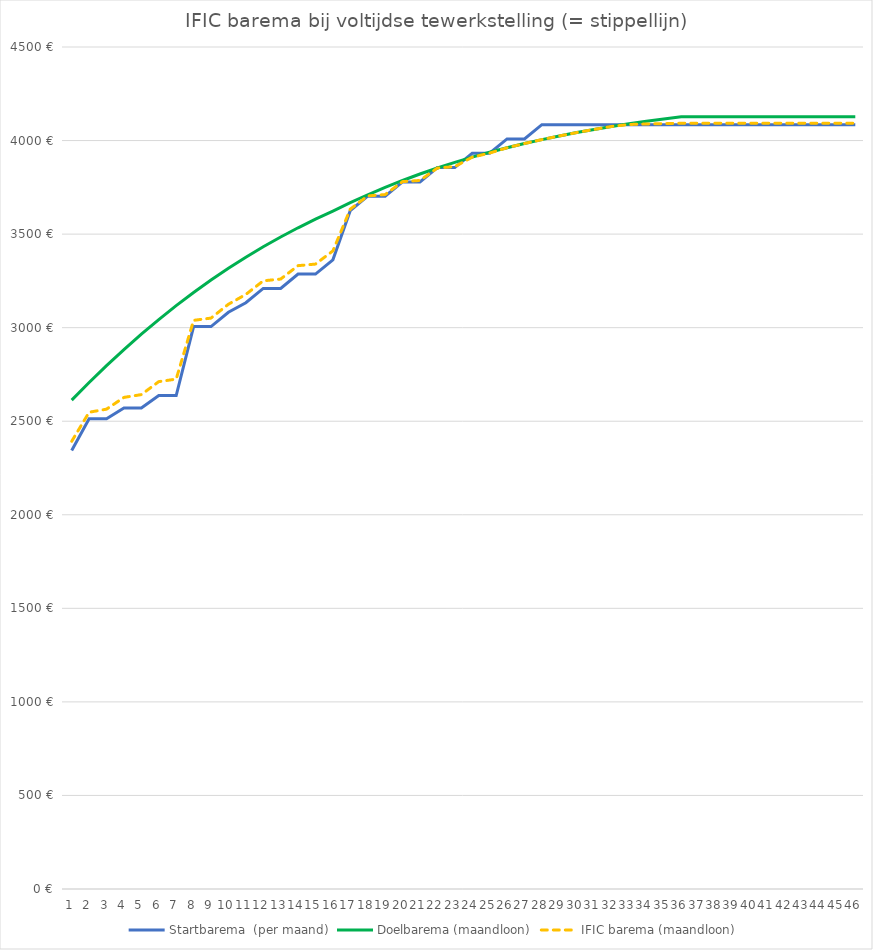
| Category | Startbarema  | Doelbarema | IFIC barema |
|---|---|---|---|
| 0 | 2343.79 | 2612.75 | 2392.88 |
| 1 | 2512.57 | 2706.81 | 2548.02 |
| 2 | 2512.57 | 2796.95 | 2564.47 |
| 3 | 2570.21 | 2883.1 | 2627.31 |
| 4 | 2570.21 | 2965.25 | 2642.3 |
| 5 | 2637.47 | 3043.4 | 2711.55 |
| 6 | 2637.47 | 3117.59 | 2725.09 |
| 7 | 3005.77 | 3187.89 | 3039.01 |
| 8 | 3005.77 | 3254.39 | 3051.14 |
| 9 | 3082.26 | 3317.18 | 3125.13 |
| 10 | 3133.25 | 3376.39 | 3177.62 |
| 11 | 3209.73 | 3432.13 | 3250.32 |
| 12 | 3209.73 | 3484.54 | 3259.88 |
| 13 | 3286.22 | 3533.76 | 3331.4 |
| 14 | 3286.22 | 3579.93 | 3339.82 |
| 15 | 3362.7 | 3623.2 | 3410.24 |
| 16 | 3626.16 | 3668.21 | 3633.83 |
| 17 | 3702.64 | 3710.35 | 3704.05 |
| 18 | 3702.64 | 3749.79 | 3711.24 |
| 19 | 3779.13 | 3786.65 | 3780.5 |
| 20 | 3779.13 | 3821.09 | 3786.79 |
| 21 | 3855.62 | 3853.23 | 3853.23 |
| 22 | 3855.62 | 3883.22 | 3860.66 |
| 23 | 3932.1 | 3911.16 | 3911.16 |
| 24 | 3932.1 | 3937.2 | 3933.03 |
| 25 | 4008.59 | 3961.45 | 3961.45 |
| 26 | 4008.59 | 3984.02 | 3984.02 |
| 27 | 4085.07 | 4005.01 | 4005.01 |
| 28 | 4085.07 | 4024.53 | 4024.53 |
| 29 | 4085.07 | 4042.67 | 4042.67 |
| 30 | 4085.07 | 4059.53 | 4059.53 |
| 31 | 4085.07 | 4075.19 | 4075.19 |
| 32 | 4085.07 | 4089.73 | 4085.92 |
| 33 | 4085.07 | 4103.23 | 4088.38 |
| 34 | 4085.07 | 4115.76 | 4090.67 |
| 35 | 4085.07 | 4127.38 | 4092.79 |
| 36 | 4085.07 | 4127.38 | 4092.79 |
| 37 | 4085.07 | 4127.38 | 4092.79 |
| 38 | 4085.07 | 4127.38 | 4092.79 |
| 39 | 4085.07 | 4127.38 | 4092.79 |
| 40 | 4085.07 | 4127.38 | 4092.79 |
| 41 | 4085.07 | 4127.38 | 4092.79 |
| 42 | 4085.07 | 4127.38 | 4092.79 |
| 43 | 4085.07 | 4127.38 | 4092.79 |
| 44 | 4085.07 | 4127.38 | 4092.79 |
| 45 | 4085.07 | 4127.38 | 4092.79 |